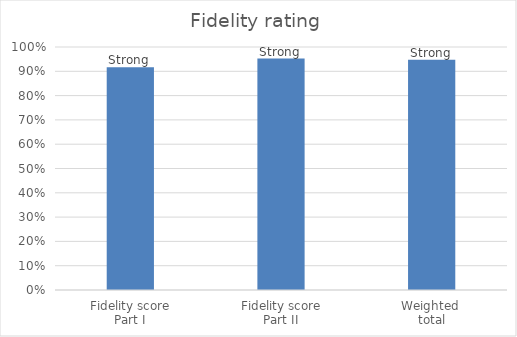
| Category | Series 0 |
|---|---|
| Fidelity score
Part I | 0.917 |
| Fidelity score
Part II | 0.952 |
| Weighted 
total | 0.948 |